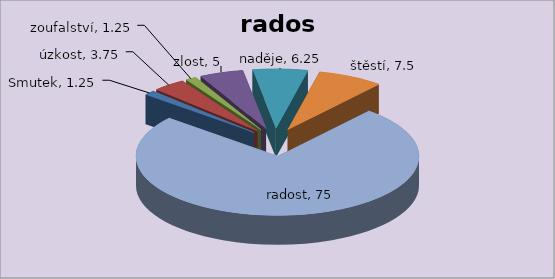
| Category | radost |
|---|---|
| Smutek | 1.25 |
| úzkost | 3.75 |
| zoufalství | 1.25 |
| zlost | 5 |
| naděje | 6.25 |
| štěstí | 7.5 |
| radost | 75 |